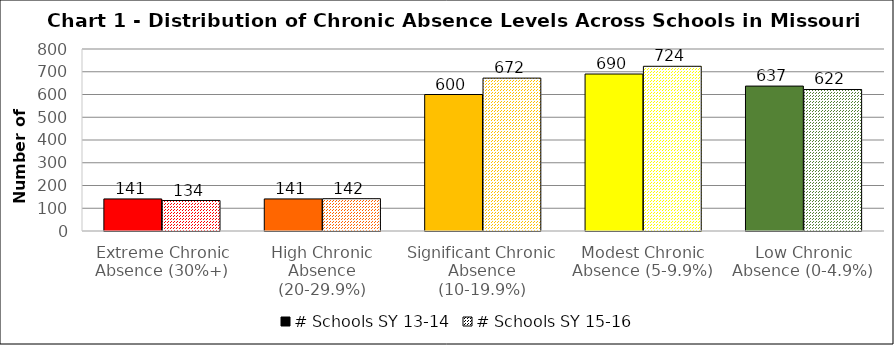
| Category | # Schools SY 13-14 | # Schools SY 15-16 |
|---|---|---|
| Extreme Chronic Absence (30%+) | 141 | 134 |
| High Chronic Absence (20-29.9%) | 141 | 142 |
| Significant Chronic Absence (10-19.9%) | 600 | 672 |
| Modest Chronic Absence (5-9.9%) | 690 | 724 |
| Low Chronic Absence (0-4.9%) | 637 | 622 |